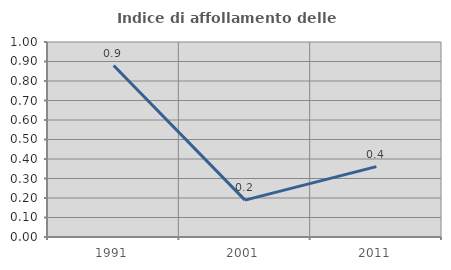
| Category | Indice di affollamento delle abitazioni  |
|---|---|
| 1991.0 | 0.879 |
| 2001.0 | 0.189 |
| 2011.0 | 0.361 |